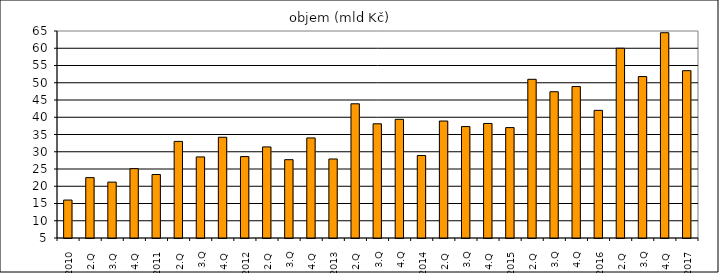
| Category | objem (mld Kč) |
|---|---|
| 1.Q 2010 | 16 |
| 2.Q  | 22.5 |
| 3.Q  | 21.2 |
| 4.Q  | 25.1 |
| 1.Q 2011 | 23.4 |
| 2.Q  | 33 |
| 3.Q | 28.5 |
| 4.Q  | 34.2 |
| 1.Q 2012 | 28.6 |
| 2.Q  | 31.4 |
| 3.Q | 27.7 |
| 4.Q  | 34 |
| 1.Q 2013 | 27.9 |
| 2.Q  | 43.9 |
| 3.Q | 38.1 |
| 4.Q | 39.4 |
| 1.Q 2014 | 28.9 |
| 2.Q  | 38.9 |
| 3.Q | 37.3 |
| 4.Q  | 38.2 |
| 1.Q 2015 | 37 |
| 2.Q  | 51 |
| 3.Q | 47.4 |
| 4.Q | 48.9 |
| 1.Q 2016 | 42 |
| 2.Q  | 60 |
| 3.Q | 51.8 |
| 4.Q  | 64.5 |
| 1.Q 2017 | 53.5 |